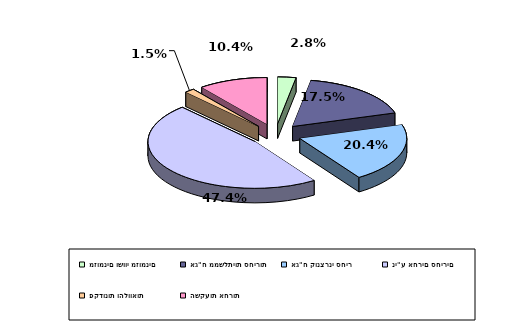
| Category | Series 0 |
|---|---|
| מזומנים ושווי מזומנים | 0.028 |
| אג"ח ממשלתיות סחירות | 0.175 |
| אג"ח קונצרני סחיר | 0.204 |
| ני"ע אחרים סחירים | 0.474 |
| פקדונות והלוואות | 0.015 |
| השקעות אחרות | 0.104 |